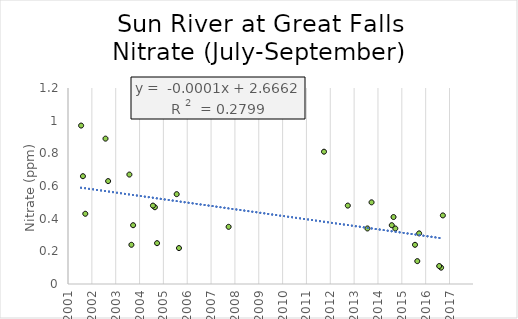
| Category | Series 0 |
|---|---|
| 42638.0 | 0.42 |
| 42611.0 | 0.1 |
| 42582.0 | 0.11 |
| 42274.0 | 0.31 |
| 42246.0 | 0.14 |
| 42211.0 | 0.24 |
| 41909.0 | 0.34 |
| 41882.0 | 0.41 |
| 41855.0 | 0.36 |
| 41545.0 | 0.5 |
| 41482.0 | 0.34 |
| 41181.0 | 0.48 |
| 40816.0 | 0.81 |
| 39354.0 | 0.35 |
| 38593.0 | 0.22 |
| 38558.0 | 0.55 |
| 38257.0 | 0.25 |
| 38224.0 | 0.47 |
| 38194.0 | 0.48 |
| 37890.0 | 0.36 |
| 37864.0 | 0.24 |
| 37833.0 | 0.67 |
| 37507.0 | 0.63 |
| 37467.0 | 0.89 |
| 37157.0 | 0.43 |
| 37121.0 | 0.66 |
| 37093.0 | 0.97 |